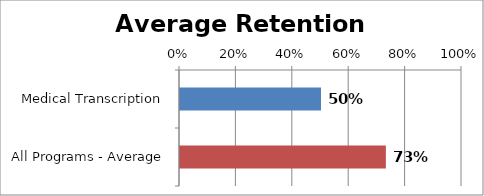
| Category | RetentionRate |
|---|---|
| Medical Transcription | 0.5 |
| All Programs - Average | 0.73 |